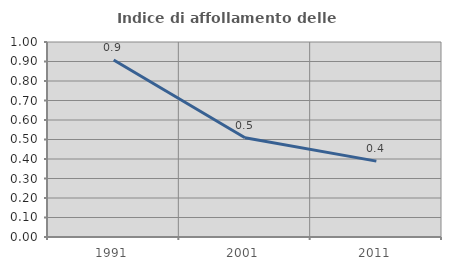
| Category | Indice di affollamento delle abitazioni  |
|---|---|
| 1991.0 | 0.907 |
| 2001.0 | 0.509 |
| 2011.0 | 0.389 |